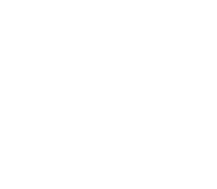
| Category | t |
|---|---|
|  | 0 |
|  | 0 |